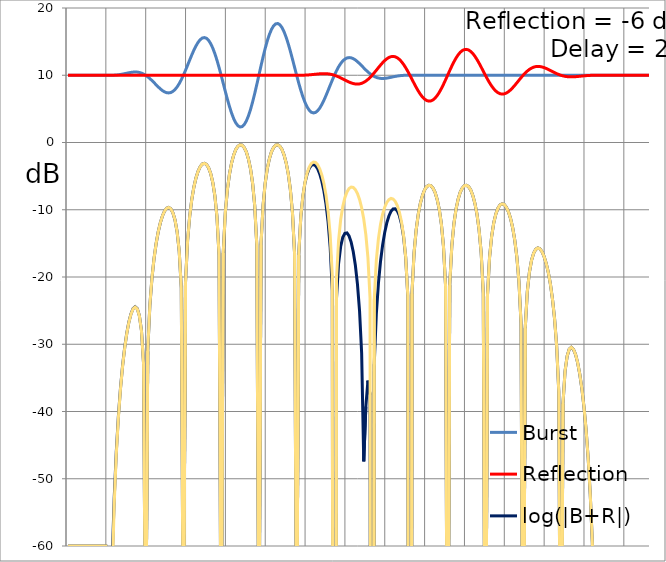
| Category | Burst | Reflection | log(|B+R|) | log(|B-R|) |
|---|---|---|---|---|
| 0 | 10 | 10 | -60 | -60 |
| 1 | 10 | 10 | -60 | -60 |
| 2 | 10 | 10 | -60 | -60 |
| 3 | 10 | 10 | -60 | -60 |
| 4 | 10 | 10 | -60 | -60 |
| 5 | 10 | 10 | -60 | -60 |
| 6 | 10 | 10 | -60 | -60 |
| 7 | 10 | 10 | -60 | -60 |
| 8 | 10 | 10 | -60 | -60 |
| 9 | 10 | 10 | -60 | -60 |
| 10 | 10 | 10 | -60 | -60 |
| 11 | 10 | 10 | -60 | -60 |
| 12 | 10 | 10 | -60 | -60 |
| 13 | 10 | 10 | -60 | -60 |
| 14 | 10 | 10 | -60 | -60 |
| 15 | 10 | 10 | -60 | -60 |
| 16 | 10 | 10 | -60 | -60 |
| 17 | 10 | 10 | -60 | -60 |
| 18 | 10 | 10 | -60 | -60 |
| 19 | 10 | 10.001 | -79.914 | -80.087 |
| 20 | 10.001 | 10.001 | -74.768 | -95.208 |
| 21 | 10.005 | 10.001 | -62.49 | -65.181 |
| 22 | 10.017 | 10.001 | -53 | -53.813 |
| 23 | 10.039 | 10.001 | -46.051 | -46.407 |
| 24 | 10.073 | 10.001 | -40.744 | -40.935 |
| 25 | 10.118 | 10.001 | -36.563 | -36.681 |
| 26 | 10.174 | 10.001 | -33.213 | -33.292 |
| 27 | 10.238 | 10.001 | -30.517 | -30.575 |
| 28 | 10.304 | 10.001 | -28.368 | -28.413 |
| 29 | 10.369 | 10.001 | -26.701 | -26.738 |
| 30 | 10.425 | 10.001 | -25.484 | -25.517 |
| 31 | 10.464 | 10.001 | -24.715 | -24.745 |
| 32 | 10.48 | 10.001 | -24.425 | -24.454 |
| 33 | 10.465 | 10.001 | -24.698 | -24.728 |
| 34 | 10.413 | 10.001 | -25.72 | -25.753 |
| 35 | 10.32 | 10.001 | -27.935 | -27.979 |
| 36 | 10.182 | 10.001 | -32.799 | -32.875 |
| 37 | 10 | 10.001 | -80 | -80 |
| 38 | 9.775 | 10.001 | -31.036 | -30.975 |
| 39 | 9.511 | 10.001 | -24.295 | -24.267 |
| 40 | 9.218 | 10.001 | -20.201 | -20.183 |
| 41 | 8.904 | 10.001 | -17.269 | -17.256 |
| 42 | 8.582 | 10.001 | -15.034 | -15.025 |
| 43 | 8.268 | 10.001 | -13.295 | -13.287 |
| 44 | 7.977 | 10.001 | -11.945 | -11.938 |
| 45 | 7.726 | 10.001 | -10.927 | -10.921 |
| 46 | 7.531 | 10.001 | -10.213 | -10.208 |
| 47 | 7.408 | 10.001 | -9.792 | -9.787 |
| 48 | 7.372 | 10.001 | -9.67 | -9.665 |
| 49 | 7.432 | 10.001 | -9.874 | -9.869 |
| 50 | 7.599 | 10.001 | -10.457 | -10.451 |
| 51 | 7.875 | 10.001 | -11.519 | -11.513 |
| 52 | 8.261 | 10.001 | -13.26 | -13.252 |
| 53 | 8.751 | 10.001 | -16.137 | -16.126 |
| 54 | 9.336 | 10.001 | -21.625 | -21.604 |
| 55 | 10 | 10.001 | -80 | -80 |
| 56 | 10.725 | 10.001 | -20.847 | -20.866 |
| 57 | 11.487 | 10.001 | -14.609 | -14.618 |
| 58 | 12.261 | 10.001 | -10.973 | -10.979 |
| 59 | 13.018 | 10.001 | -8.466 | -8.471 |
| 60 | 13.727 | 10.001 | -6.632 | -6.636 |
| 61 | 14.361 | 10.001 | -5.269 | -5.272 |
| 62 | 14.889 | 10.001 | -4.276 | -4.279 |
| 63 | 15.287 | 10.001 | -3.597 | -3.6 |
| 64 | 15.531 | 10.001 | -3.205 | -3.207 |
| 65 | 15.604 | 10.001 | -3.091 | -3.093 |
| 66 | 15.494 | 10.001 | -3.262 | -3.265 |
| 67 | 15.196 | 10.001 | -3.747 | -3.749 |
| 68 | 14.711 | 10.001 | -4.599 | -4.602 |
| 69 | 14.046 | 10.001 | -5.92 | -5.923 |
| 70 | 13.218 | 10.001 | -7.909 | -7.914 |
| 71 | 12.247 | 10.001 | -11.025 | -11.031 |
| 72 | 11.164 | 10.001 | -16.738 | -16.75 |
| 73 | 10 | 10.001 | -80 | -80 |
| 74 | 8.793 | 10.001 | -16.436 | -16.424 |
| 75 | 7.584 | 10.001 | -10.402 | -10.397 |
| 76 | 6.413 | 10.001 | -6.97 | -6.966 |
| 77 | 5.323 | 10.001 | -4.663 | -4.66 |
| 78 | 4.352 | 10.001 | -3.024 | -3.022 |
| 79 | 3.536 | 10.001 | -1.853 | -1.851 |
| 80 | 2.907 | 10.001 | -1.046 | -1.044 |
| 81 | 2.491 | 10.001 | -0.551 | -0.549 |
| 82 | 2.304 | 10.001 | -0.338 | -0.336 |
| 83 | 2.359 | 10.001 | -0.4 | -0.398 |
| 84 | 2.656 | 10.001 | -0.745 | -0.743 |
| 85 | 3.19 | 10.001 | -1.4 | -1.398 |
| 86 | 3.944 | 10.001 | -2.42 | -2.417 |
| 87 | 4.897 | 10.001 | -3.906 | -3.904 |
| 88 | 6.017 | 10.001 | -6.06 | -6.056 |
| 89 | 7.269 | 10.001 | -9.338 | -9.333 |
| 90 | 8.611 | 10.001 | -15.216 | -15.206 |
| 91 | 10 | 10.001 | -80 | -80 |
| 92 | 11.389 | 10.001 | -15.206 | -15.216 |
| 93 | 12.731 | 10.001 | -9.333 | -9.338 |
| 94 | 13.983 | 10.001 | -6.056 | -6.06 |
| 95 | 15.103 | 10.001 | -3.904 | -3.906 |
| 96 | 16.056 | 10.001 | -2.417 | -2.42 |
| 97 | 16.81 | 10.001 | -1.398 | -1.4 |
| 98 | 17.344 | 10.001 | -0.743 | -0.745 |
| 99 | 17.641 | 10.001 | -0.398 | -0.4 |
| 100 | 17.696 | 10.001 | -0.336 | -0.338 |
| 101 | 17.509 | 10.001 | -0.549 | -0.551 |
| 102 | 17.093 | 10.001 | -1.044 | -1.046 |
| 103 | 16.464 | 10.001 | -1.851 | -1.853 |
| 104 | 15.648 | 10.001 | -3.022 | -3.024 |
| 105 | 14.677 | 10.001 | -4.66 | -4.663 |
| 106 | 13.587 | 10.001 | -6.966 | -6.97 |
| 107 | 12.416 | 10.001 | -10.397 | -10.402 |
| 108 | 11.207 | 10.001 | -16.424 | -16.436 |
| 109 | 10 | 10.001 | -80 | -80 |
| 110 | 8.836 | 10 | -16.746 | -16.741 |
| 111 | 7.753 | 10.003 | -11.038 | -11.018 |
| 112 | 6.782 | 10.009 | -7.934 | -7.888 |
| 113 | 5.954 | 10.02 | -5.964 | -5.88 |
| 114 | 5.289 | 10.036 | -4.668 | -4.534 |
| 115 | 4.804 | 10.059 | -3.847 | -3.65 |
| 116 | 4.506 | 10.087 | -3.402 | -3.127 |
| 117 | 4.396 | 10.119 | -3.278 | -2.91 |
| 118 | 4.469 | 10.152 | -3.449 | -2.97 |
| 119 | 4.713 | 10.185 | -3.907 | -3.3 |
| 120 | 5.111 | 10.212 | -4.663 | -3.908 |
| 121 | 5.639 | 10.232 | -5.746 | -4.82 |
| 122 | 6.273 | 10.24 | -7.212 | -6.092 |
| 123 | 6.982 | 10.232 | -9.165 | -7.824 |
| 124 | 7.739 | 10.207 | -11.808 | -10.216 |
| 125 | 8.513 | 10.16 | -15.603 | -13.726 |
| 126 | 9.275 | 10.091 | -22.025 | -19.827 |
| 127 | 10 | 10 | -308.908 | -308.484 |
| 128 | 10.664 | 9.887 | -23.229 | -20.254 |
| 129 | 11.249 | 9.756 | -18.023 | -14.579 |
| 130 | 11.739 | 9.609 | -15.47 | -11.493 |
| 131 | 12.125 | 9.452 | -14.108 | -9.522 |
| 132 | 12.401 | 9.291 | -13.493 | -8.207 |
| 133 | 12.568 | 9.134 | -13.445 | -7.347 |
| 134 | 12.628 | 8.988 | -13.888 | -6.84 |
| 135 | 12.592 | 8.863 | -14.806 | -6.63 |
| 136 | 12.469 | 8.765 | -16.231 | -6.689 |
| 137 | 12.274 | 8.704 | -18.251 | -7.007 |
| 138 | 12.023 | 8.686 | -21.05 | -7.594 |
| 139 | 11.732 | 8.716 | -25.031 | -8.474 |
| 140 | 11.418 | 8.8 | -31.32 | -9.701 |
| 141 | 11.096 | 8.938 | -47.416 | -11.378 |
| 142 | 10.782 | 9.131 | -39.272 | -13.702 |
| 143 | 10.489 | 9.376 | -35.408 | -17.131 |
| 144 | 10.225 | 9.668 | -37.489 | -23.137 |
| 145 | 10 | 10 | -323.831 | -314.57 |
| 146 | 9.818 | 10.362 | -32.958 | -23.335 |
| 147 | 9.68 | 10.744 | -25.523 | -17.525 |
| 148 | 9.587 | 11.131 | -20.949 | -14.29 |
| 149 | 9.535 | 11.509 | -17.689 | -12.156 |
| 150 | 9.52 | 11.864 | -15.24 | -10.664 |
| 151 | 9.536 | 12.18 | -13.37 | -9.615 |
| 152 | 9.575 | 12.445 | -11.956 | -8.906 |
| 153 | 9.631 | 12.643 | -10.925 | -8.484 |
| 154 | 9.696 | 12.765 | -10.24 | -8.319 |
| 155 | 9.762 | 12.802 | -9.882 | -8.406 |
| 156 | 9.826 | 12.747 | -9.852 | -8.751 |
| 157 | 9.882 | 12.598 | -10.173 | -9.383 |
| 158 | 9.927 | 12.355 | -10.893 | -10.357 |
| 159 | 9.961 | 12.023 | -12.111 | -11.776 |
| 160 | 9.983 | 11.609 | -14.025 | -13.84 |
| 161 | 9.995 | 11.124 | -17.089 | -17.008 |
| 162 | 9.999 | 10.582 | -22.774 | -22.755 |
| 163 | 10 | 10 | -316.09 | -316.09 |
| 164 | 10 | 9.397 | -22.452 | -22.449 |
| 165 | 10 | 8.792 | -16.421 | -16.42 |
| 166 | 10 | 8.207 | -12.989 | -12.988 |
| 167 | 10 | 7.661 | -10.683 | -10.682 |
| 168 | 10 | 7.176 | -9.044 | -9.044 |
| 169 | 10 | 6.768 | -7.872 | -7.872 |
| 170 | 10 | 6.454 | -7.066 | -7.066 |
| 171 | 10 | 6.245 | -6.57 | -6.57 |
| 172 | 10 | 6.152 | -6.358 | -6.357 |
| 173 | 10 | 6.18 | -6.42 | -6.419 |
| 174 | 10 | 6.328 | -6.764 | -6.764 |
| 175 | 10 | 6.595 | -7.419 | -7.419 |
| 176 | 10 | 6.972 | -8.439 | -8.439 |
| 177 | 10 | 7.448 | -9.926 | -9.925 |
| 178 | 10 | 8.009 | -12.079 | -12.078 |
| 179 | 10 | 8.635 | -15.357 | -15.356 |
| 180 | 10 | 9.306 | -21.232 | -21.23 |
| 181 | 10 | 10 | -100 | -100 |
| 182 | 10 | 10.694 | -21.23 | -21.232 |
| 183 | 10 | 11.365 | -15.356 | -15.357 |
| 184 | 10 | 11.991 | -12.078 | -12.079 |
| 185 | 10 | 12.552 | -9.925 | -9.926 |
| 186 | 10 | 13.028 | -8.439 | -8.439 |
| 187 | 10 | 13.405 | -7.419 | -7.419 |
| 188 | 10 | 13.672 | -6.764 | -6.764 |
| 189 | 10 | 13.82 | -6.419 | -6.42 |
| 190 | 10 | 13.848 | -6.357 | -6.358 |
| 191 | 10 | 13.755 | -6.57 | -6.57 |
| 192 | 10 | 13.546 | -7.066 | -7.066 |
| 193 | 10 | 13.232 | -7.872 | -7.872 |
| 194 | 10 | 12.824 | -9.044 | -9.044 |
| 195 | 10 | 12.339 | -10.682 | -10.683 |
| 196 | 10 | 11.793 | -12.988 | -12.989 |
| 197 | 10 | 11.208 | -16.42 | -16.421 |
| 198 | 10 | 10.603 | -22.449 | -22.452 |
| 199 | 10 | 10 | -100 | -100 |
| 200 | 10 | 9.418 | -22.766 | -22.763 |
| 201 | 10 | 8.876 | -17.049 | -17.048 |
| 202 | 10 | 8.391 | -13.932 | -13.932 |
| 203 | 10 | 7.977 | -11.942 | -11.942 |
| 204 | 10 | 7.645 | -10.621 | -10.621 |
| 205 | 10 | 7.402 | -9.769 | -9.768 |
| 206 | 10 | 7.253 | -9.284 | -9.284 |
| 207 | 10 | 7.198 | -9.113 | -9.112 |
| 208 | 10 | 7.235 | -9.227 | -9.226 |
| 209 | 10 | 7.357 | -9.619 | -9.619 |
| 210 | 10 | 7.555 | -10.298 | -10.298 |
| 211 | 10 | 7.82 | -11.292 | -11.291 |
| 212 | 10 | 8.136 | -12.655 | -12.654 |
| 213 | 10 | 8.491 | -14.49 | -14.489 |
| 214 | 10 | 8.869 | -16.997 | -16.996 |
| 215 | 10 | 9.256 | -20.635 | -20.633 |
| 216 | 10 | 9.638 | -26.879 | -26.875 |
| 217 | 10 | 10 | -100 | -100 |
| 218 | 10 | 10.332 | -27.633 | -27.637 |
| 219 | 10 | 10.624 | -22.151 | -22.153 |
| 220 | 10 | 10.869 | -19.276 | -19.277 |
| 221 | 10 | 11.062 | -17.536 | -17.537 |
| 222 | 10 | 11.2 | -16.474 | -16.475 |
| 223 | 10 | 11.284 | -15.892 | -15.893 |
| 224 | 10 | 11.314 | -15.688 | -15.689 |
| 225 | 10 | 11.296 | -15.809 | -15.81 |
| 226 | 10 | 11.235 | -16.23 | -16.232 |
| 227 | 10 | 11.137 | -16.944 | -16.946 |
| 228 | 10 | 11.012 | -17.961 | -17.962 |
| 229 | 10 | 10.866 | -19.31 | -19.312 |
| 230 | 10 | 10.709 | -21.049 | -21.051 |
| 231 | 10 | 10.548 | -23.282 | -23.284 |
| 232 | 10 | 10.391 | -26.211 | -26.215 |
| 233 | 10 | 10.244 | -30.299 | -30.304 |
| 234 | 10 | 10.113 | -37.02 | -37.032 |
| 235 | 10 | 10 | -100 | -100 |
| 236 | 10 | 9.909 | -38.865 | -38.85 |
| 237 | 10 | 9.84 | -33.982 | -33.973 |
| 238 | 10 | 9.793 | -31.761 | -31.754 |
| 239 | 10 | 9.768 | -30.737 | -30.731 |
| 240 | 10 | 9.76 | -30.463 | -30.457 |
| 241 | 10 | 9.768 | -30.753 | -30.747 |
| 242 | 10 | 9.788 | -31.524 | -31.517 |
| 243 | 10 | 9.815 | -32.744 | -32.736 |
| 244 | 10 | 9.848 | -34.416 | -34.407 |
| 245 | 10 | 9.881 | -36.573 | -36.561 |
| 246 | 10 | 9.913 | -39.281 | -39.265 |
| 247 | 10 | 9.941 | -42.654 | -42.63 |
| 248 | 10 | 9.964 | -46.879 | -46.841 |
| 249 | 10 | 9.98 | -52.283 | -52.212 |
| 250 | 10 | 9.991 | -59.499 | -59.336 |
| 251 | 10 | 9.997 | -70.024 | -69.489 |
| 252 | 10 | 10 | -90.084 | -85.794 |
| 253 | 10 | 10 | -100 | -100 |
| 254 | 10 | 10 | -100 | -100 |
| 255 | 10 | 10 | -100 | -100 |
| 256 | 10 | 10 | -100 | -100 |
| 257 | 10 | 10 | -100 | -100 |
| 258 | 10 | 10 | -100 | -100 |
| 259 | 10 | 10 | -100 | -100 |
| 260 | 10 | 10 | -100 | -100 |
| 261 | 10 | 10 | -100 | -100 |
| 262 | 10 | 10 | -100 | -100 |
| 263 | 10 | 10 | -100 | -100 |
| 264 | 10 | 10 | -100 | -100 |
| 265 | 10 | 10 | -100 | -100 |
| 266 | 10 | 10 | -100 | -100 |
| 267 | 10 | 10 | -100 | -100 |
| 268 | 10 | 10 | -100 | -100 |
| 269 | 10 | 10 | -100 | -100 |
| 270 | 10 | 10 | -100 | -100 |
| 271 | 10 | 10 | -100 | -100 |
| 272 | 10 | 10 | -100 | -100 |
| 273 | 10 | 10 | -100 | -100 |
| 274 | 10 | 10 | -100 | -100 |
| 275 | 10 | 10 | -100 | -100 |
| 276 | 10 | 10 | -100 | -100 |
| 277 | 10 | 10 | -100 | -100 |